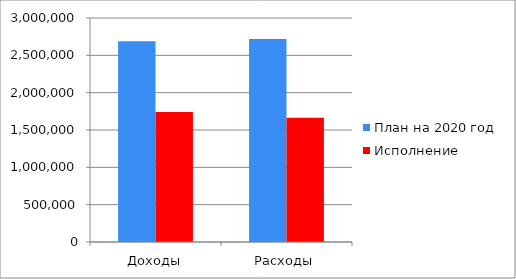
| Category | План на 2020 год | Исполнение |
|---|---|---|
| Доходы | 2687878.9 | 1740303.99 |
| Расходы | 2717157.5 | 1662871.21 |